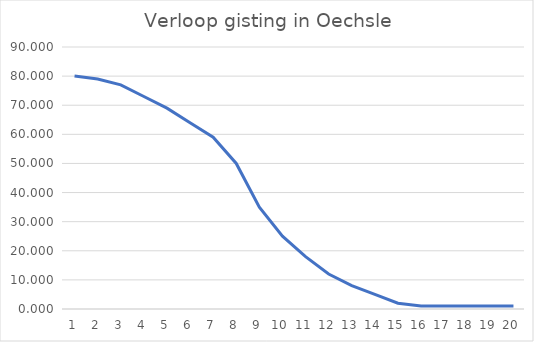
| Category | Series 0 |
|---|---|
| 0 | 80 |
| 1 | 79 |
| 2 | 77 |
| 3 | 73 |
| 4 | 69 |
| 5 | 64 |
| 6 | 59 |
| 7 | 50 |
| 8 | 35 |
| 9 | 25 |
| 10 | 18 |
| 11 | 12 |
| 12 | 8 |
| 13 | 5 |
| 14 | 2 |
| 15 | 1 |
| 16 | 0.997 |
| 17 | 0.995 |
| 18 | 0.994 |
| 19 | 0.994 |